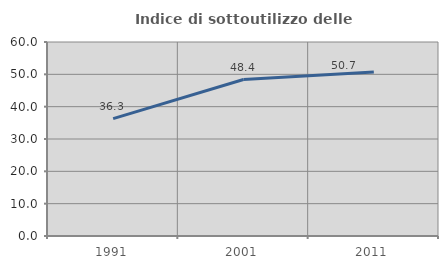
| Category | Indice di sottoutilizzo delle abitazioni  |
|---|---|
| 1991.0 | 36.296 |
| 2001.0 | 48.399 |
| 2011.0 | 50.69 |